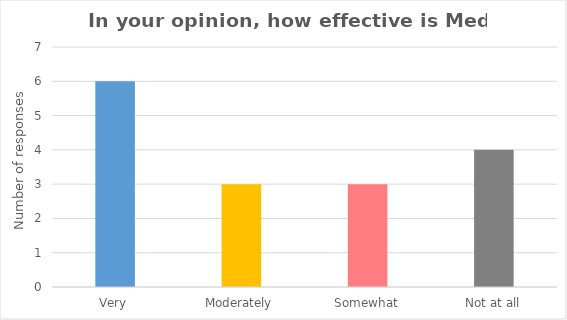
| Category | Series 0 |
|---|---|
| Very | 6 |
| Moderately | 3 |
| Somewhat | 3 |
| Not at all | 4 |